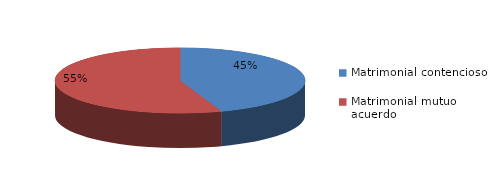
| Category | Series 0 |
|---|---|
| 0 | 567 |
| 1 | 703 |